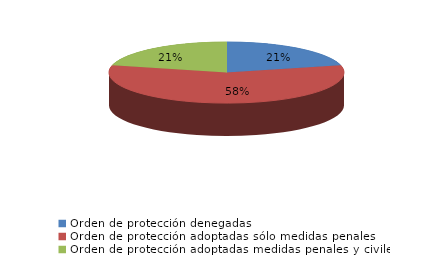
| Category | Series 0 |
|---|---|
| Orden de protección denegadas | 7 |
| Orden de protección adoptadas sólo medidas penales | 19 |
| Orden de protección adoptadas medidas penales y civiles | 7 |